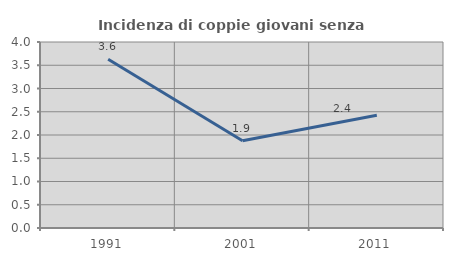
| Category | Incidenza di coppie giovani senza figli |
|---|---|
| 1991.0 | 3.629 |
| 2001.0 | 1.878 |
| 2011.0 | 2.424 |